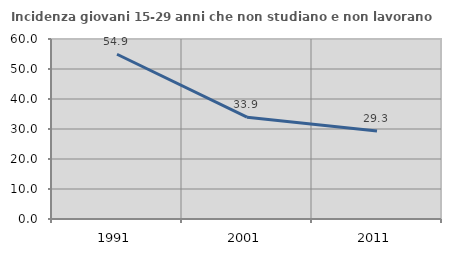
| Category | Incidenza giovani 15-29 anni che non studiano e non lavorano  |
|---|---|
| 1991.0 | 54.925 |
| 2001.0 | 33.937 |
| 2011.0 | 29.348 |